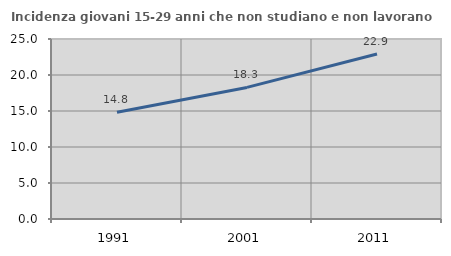
| Category | Incidenza giovani 15-29 anni che non studiano e non lavorano  |
|---|---|
| 1991.0 | 14.828 |
| 2001.0 | 18.276 |
| 2011.0 | 22.909 |